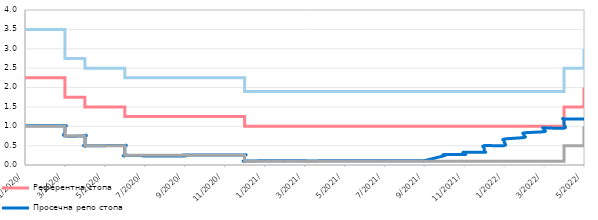
| Category | Референтна стопа | Просечна репо стопа | Каматна стопа на кредитне олакшице | Каматна стопа на депозитне олакшице |
|---|---|---|---|---|
| 2020-01-08 | 2.25 | 1.01 | 3.5 | 1 |
| 2020-01-15 | 2.25 | 1.01 | 3.5 | 1 |
| 2020-01-22 | 2.25 | 1.01 | 3.5 | 1 |
| 2020-01-29 | 2.25 | 1.01 | 3.5 | 1 |
| 2020-02-05 | 2.25 | 1.01 | 3.5 | 1 |
| 2020-02-12 | 2.25 | 1.01 | 3.5 | 1 |
| 2020-02-19 | 2.25 | 1.01 | 3.5 | 1 |
| 2020-02-26 | 2.25 | 1.01 | 3.5 | 1 |
| 2020-03-04 | 2.25 | 1.01 | 3.5 | 1 |
| 2020-03-11 | 2.25 | 1 | 3.5 | 1 |
| 2020-03-18 | 1.75 | 0.85 | 2.75 | 0.75 |
| 2020-03-25 | 1.75 | 0.75 | 2.75 | 0.75 |
| 2020-04-01 | 1.75 | 0.75 | 2.75 | 0.75 |
| 2020-04-08 | 1.75 | 0.75 | 2.75 | 0.75 |
| 2020-04-15 | 1.5 | 0.5 | 2.5 | 0.5 |
| 2020-04-22 | 1.5 | 0.5 | 2.5 | 0.5 |
| 2020-04-29 | 1.5 | 0.5 | 2.5 | 0.5 |
| 2020-05-06 | 1.5 | 0.5 | 2.5 | 0.5 |
| 2020-05-13 | 1.5 | 0.5 | 2.5 | 0.5 |
| 2020-05-20 | 1.5 | 0.5 | 2.5 | 0.5 |
| 2020-05-27 | 1.5 | 0.5 | 2.5 | 0.5 |
| 2020-06-03 | 1.5 | 0.5 | 2.5 | 0.5 |
| 2020-06-10 | 1.5 | 0.49 | 2.5 | 0.5 |
| 2020-06-17 | 1.25 | 0.25 | 2.25 | 0.25 |
| 2020-06-24 | 1.25 | 0.25 | 2.25 | 0.25 |
| 2020-07-01 | 1.25 | 0.24 | 2.25 | 0.25 |
| 2020-07-08 | 1.25 | 0.24 | 2.25 | 0.25 |
| 2020-07-15 | 1.25 | 0.23 | 2.25 | 0.25 |
| 2020-07-22 | 1.25 | 0.23 | 2.25 | 0.25 |
| 2020-07-29 | 1.25 | 0.23 | 2.25 | 0.25 |
| 2020-08-05 | 1.25 | 0.23 | 2.25 | 0.25 |
| 2020-08-12 | 1.25 | 0.23 | 2.25 | 0.25 |
| 2020-08-19 | 1.25 | 0.23 | 2.25 | 0.25 |
| 2020-08-26 | 1.25 | 0.23 | 2.25 | 0.25 |
| 2020-09-02 | 1.25 | 0.23 | 2.25 | 0.25 |
| 2020-09-09 | 1.25 | 0.24 | 2.25 | 0.25 |
| 2020-09-16 | 1.25 | 0.25 | 2.25 | 0.25 |
| 2020-09-23 | 1.25 | 0.25 | 2.25 | 0.25 |
| 2020-09-30 | 1.25 | 0.26 | 2.25 | 0.25 |
| 2020-10-07 | 1.25 | 0.26 | 2.25 | 0.25 |
| 2020-10-14 | 1.25 | 0.26 | 2.25 | 0.25 |
| 2020-10-21 | 1.25 | 0.26 | 2.25 | 0.25 |
| 2020-10-28 | 1.25 | 0.26 | 2.25 | 0.25 |
| 2020-11-04 | 1.25 | 0.26 | 2.25 | 0.25 |
| 2020-11-10 | 1.25 | 0.26 | 2.25 | 0.25 |
| 2020-11-18 | 1.25 | 0.26 | 2.25 | 0.25 |
| 2020-11-26 | 1.25 | 0.26 | 2.25 | 0.25 |
| 2020-12-02 | 1.25 | 0.26 | 2.25 | 0.25 |
| 2020-12-09 | 1.25 | 0.25 | 2.25 | 0.25 |
| 2020-12-16 | 1 | 0.1 | 1.9 | 0.1 |
| 2020-12-23 | 1 | 0.1 | 1.9 | 0.1 |
| 2020-12-30 | 1 | 0.1 | 1.9 | 0.1 |
| 2021-01-06 | 1 | 0.11 | 1.9 | 0.1 |
| 2021-01-13 | 1 | 0.11 | 1.9 | 0.1 |
| 2021-01-20 | 1 | 0.11 | 1.9 | 0.1 |
| 2021-01-27 | 1 | 0.11 | 1.9 | 0.1 |
| 2021-02-03 | 1 | 0.11 | 1.9 | 0.1 |
| 2021-02-10 | 1 | 0.11 | 1.9 | 0.1 |
| 2021-02-17 | 1 | 0.1 | 1.9 | 0.1 |
| 2021-02-24 | 1 | 0.11 | 1.9 | 0.1 |
| 2021-03-03 | 1 | 0.11 | 1.9 | 0.1 |
| 2021-03-10 | 1 | 0.11 | 1.9 | 0.1 |
| 2021-03-17 | 1 | 0.11 | 1.9 | 0.1 |
| 2021-03-24 | 1 | 0.11 | 1.9 | 0.1 |
| 2021-03-31 | 1 | 0.1 | 1.9 | 0.1 |
| 2021-04-07 | 1 | 0.11 | 1.9 | 0.1 |
| 2021-04-14 | 1 | 0.11 | 1.9 | 0.1 |
| 2021-04-21 | 1 | 0.11 | 1.9 | 0.1 |
| 2021-04-28 | 1 | 0.11 | 1.9 | 0.1 |
| 2021-05-05 | 1 | 0.11 | 1.9 | 0.1 |
| 2021-05-12 | 1 | 0.11 | 1.9 | 0.1 |
| 2021-05-19 | 1 | 0.11 | 1.9 | 0.1 |
| 2021-05-26 | 1 | 0.11 | 1.9 | 0.1 |
| 2021-06-02 | 1 | 0.11 | 1.9 | 0.1 |
| 2021-06-09 | 1 | 0.11 | 1.9 | 0.1 |
| 2021-06-16 | 1 | 0.11 | 1.9 | 0.1 |
| 2021-06-23 | 1 | 0.11 | 1.9 | 0.1 |
| 2021-06-30 | 1 | 0.11 | 1.9 | 0.1 |
| 2021-07-07 | 1 | 0.11 | 1.9 | 0.1 |
| 2021-07-14 | 1 | 0.11 | 1.9 | 0.1 |
| 2021-07-21 | 1 | 0.11 | 1.9 | 0.1 |
| 2021-07-28 | 1 | 0.11 | 1.9 | 0.1 |
| 2021-08-04 | 1 | 0.11 | 1.9 | 0.1 |
| 2021-08-11 | 1 | 0.11 | 1.9 | 0.1 |
| 2021-08-18 | 1 | 0.11 | 1.9 | 0.1 |
| 2021-08-25 | 1 | 0.11 | 1.9 | 0.1 |
| 2021-09-01 | 1 | 0.11 | 1.9 | 0.1 |
| 2021-09-08 | 1 | 0.11 | 1.9 | 0.1 |
| 2021-09-15 | 1 | 0.11 | 1.9 | 0.1 |
| 2021-09-22 | 1 | 0.11 | 1.9 | 0.1 |
| 2021-09-29 | 1 | 0.11 | 1.9 | 0.1 |
| 2021-10-06 | 1 | 0.24 | 1.9 | 0.1 |
| 2021-10-13 | 1 | 0.25 | 1.9 | 0.1 |
| 2021-10-20 | 1 | 0.26 | 1.9 | 0.1 |
| 2021-10-27 | 1 | 0.27 | 1.9 | 0.1 |
| 2021-11-03 | 1 | 0.27 | 1.9 | 0.1 |
| 2021-11-10 | 1 | 0.28 | 1.9 | 0.1 |
| 2021-11-17 | 1 | 0.3 | 1.9 | 0.1 |
| 2021-11-24 | 1 | 0.33 | 1.9 | 0.1 |
| 2021-12-01 | 1 | 0.33 | 1.9 | 0.1 |
| 2021-12-08 | 1 | 0.34 | 1.9 | 0.1 |
| 2021-12-15 | 1 | 0.39 | 1.9 | 0.1 |
| 2021-12-22 | 1 | 0.44 | 1.9 | 0.1 |
| 2021-12-29 | 1 | 0.5 | 1.9 | 0.1 |
| 2022-01-05 | 1 | 0.5 | 1.9 | 0.1 |
| 2022-01-12 | 1 | 0.59 | 1.9 | 0.1 |
| 2022-01-19 | 1 | 0.63 | 1.9 | 0.1 |
| 2022-01-26 | 1 | 0.67 | 1.9 | 0.1 |
| 2022-02-02 | 1 | 0.71 | 1.9 | 0.1 |
| 2022-02-09 | 1 | 0.75 | 1.9 | 0.1 |
| 2022-02-16 | 1 | 0.79 | 1.9 | 0.1 |
| 2022-02-23 | 1 | 0.83 | 1.9 | 0.1 |
| 2022-03-02 | 1 | 0.86 | 1.9 | 0.1 |
| 2022-03-09 | 1 | 0.9 | 1.9 | 0.1 |
| 2022-03-16 | 1 | 0.93 | 1.9 | 0.1 |
| 2022-03-23 | 1 | 0.95 | 1.9 | 0.1 |
| 2022-03-30 | 1 | 0.96 | 1.9 | 0.1 |
| 2022-04-06 | 1 | 0.95 | 1.9 | 0.1 |
| 2022-04-13 | 1.5 | 1.05 | 2.5 | 0.5 |
| 2022-04-20 | 1.5 | 1.19 | 2.5 | 0.5 |
| 2022-04-27 | 1.5 | 1.19 | 2.5 | 0.5 |
| 2022-05-04 | 1.5 | 1.19 | 2.5 | 0.5 |
| 2022-05-12 | 2 | 1.21 | 3 | 1 |